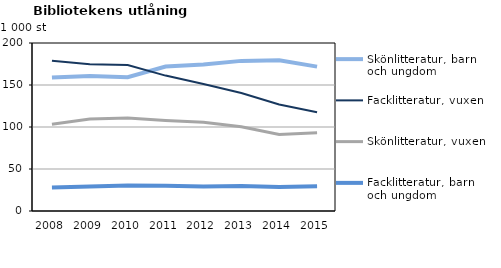
| Category | Skönlitteratur, barn och ungdom | Facklitteratur, vuxen | Skönlitteratur, vuxen | Facklitteratur, barn och ungdom |
|---|---|---|---|---|
| 2008.0 | 159.009 | 178.797 | 103.214 | 28.076 |
| 2009.0 | 160.836 | 174.694 | 109.393 | 29.18 |
| 2010.0 | 159.326 | 173.87 | 110.584 | 30.223 |
| 2011.0 | 171.928 | 161.199 | 107.738 | 30.111 |
| 2012.0 | 174.437 | 151.244 | 105.53 | 29.231 |
| 2013.0 | 178.711 | 140.567 | 100.262 | 29.737 |
| 2014.0 | 179.405 | 126.868 | 91.115 | 28.523 |
| 2015.0 | 171.907 | 117.574 | 93.15 | 29.409 |